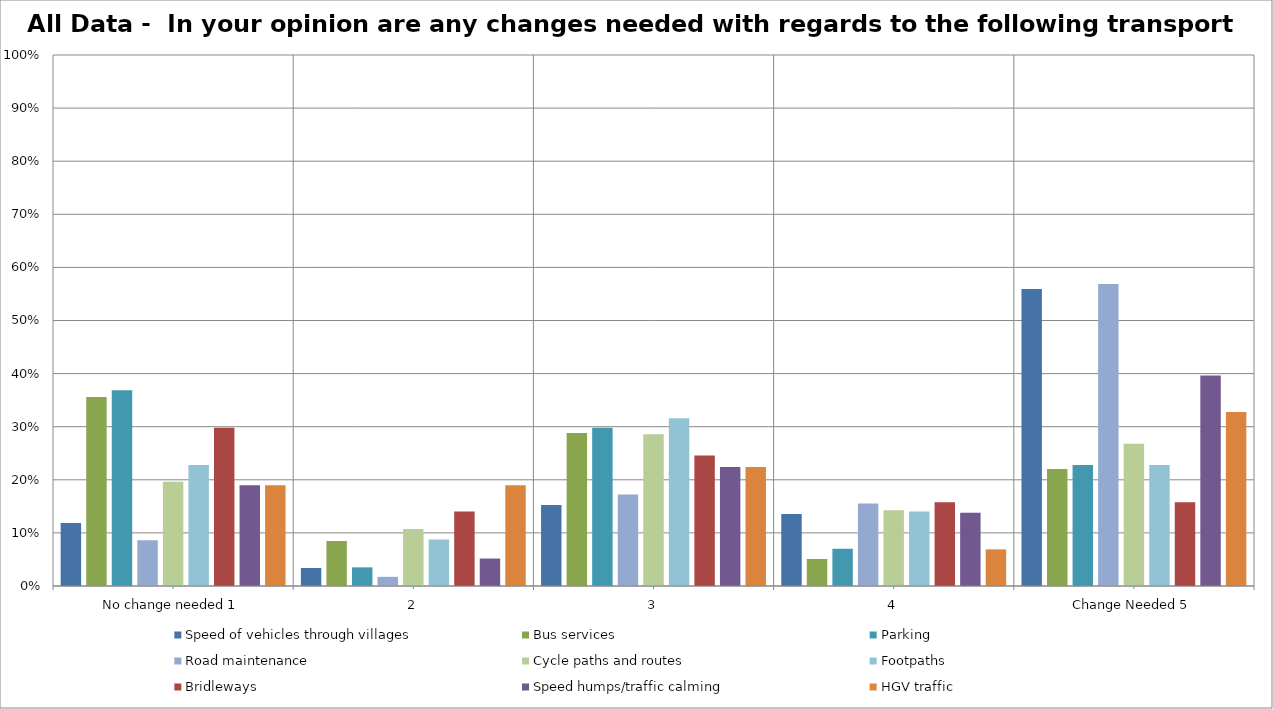
| Category | Speed of vehicles through villages | Bus services | Parking | Road maintenance | Cycle paths and routes | Footpaths | Bridleways | Speed humps/traffic calming | HGV traffic |
|---|---|---|---|---|---|---|---|---|---|
| No change needed 1 | 0.119 | 0.356 | 0.368 | 0.086 | 0.196 | 0.228 | 0.298 | 0.19 | 0.19 |
| 2 | 0.034 | 0.085 | 0.035 | 0.017 | 0.107 | 0.088 | 0.14 | 0.052 | 0.19 |
| 3 | 0.153 | 0.288 | 0.298 | 0.172 | 0.286 | 0.316 | 0.246 | 0.224 | 0.224 |
| 4 | 0.136 | 0.051 | 0.07 | 0.155 | 0.143 | 0.14 | 0.158 | 0.138 | 0.069 |
| Change Needed 5 | 0.559 | 0.22 | 0.228 | 0.569 | 0.268 | 0.228 | 0.158 | 0.397 | 0.328 |